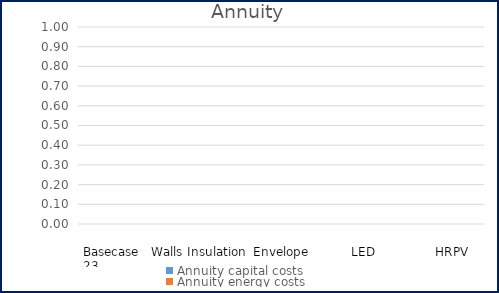
| Category | Annuity capital costs | Annuity energy costs |
|---|---|---|
| Basecase | 0 | 0 |
| 0 | 0 | 0 |
| 0 | 0 | 0 |
| 0 | 0 | 0 |
| 0 | 0 | 0 |
| 0 | 0 | 0 |